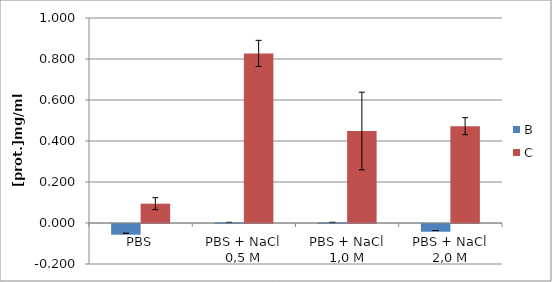
| Category | B | C |
|---|---|---|
| PBS | -0.052 | 0.094 |
| PBS + NaCl 0,5 M | 0.003 | 0.827 |
| PBS + NaCl 1,0 M | 0.003 | 0.449 |
| PBS + NaCl 2,0 M | -0.038 | 0.472 |